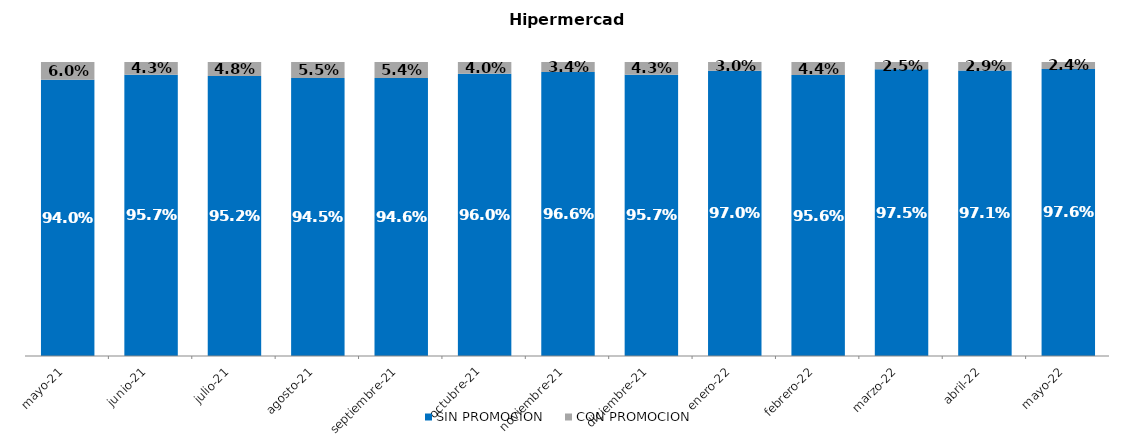
| Category | SIN PROMOCION   | CON PROMOCION   |
|---|---|---|
| 2021-05-01 | 0.94 | 0.06 |
| 2021-06-01 | 0.957 | 0.043 |
| 2021-07-01 | 0.952 | 0.048 |
| 2021-08-01 | 0.945 | 0.055 |
| 2021-09-01 | 0.946 | 0.054 |
| 2021-10-01 | 0.96 | 0.04 |
| 2021-11-01 | 0.966 | 0.034 |
| 2021-12-01 | 0.957 | 0.043 |
| 2022-01-01 | 0.97 | 0.03 |
| 2022-02-01 | 0.956 | 0.044 |
| 2022-03-01 | 0.975 | 0.025 |
| 2022-04-01 | 0.971 | 0.029 |
| 2022-05-01 | 0.976 | 0.024 |